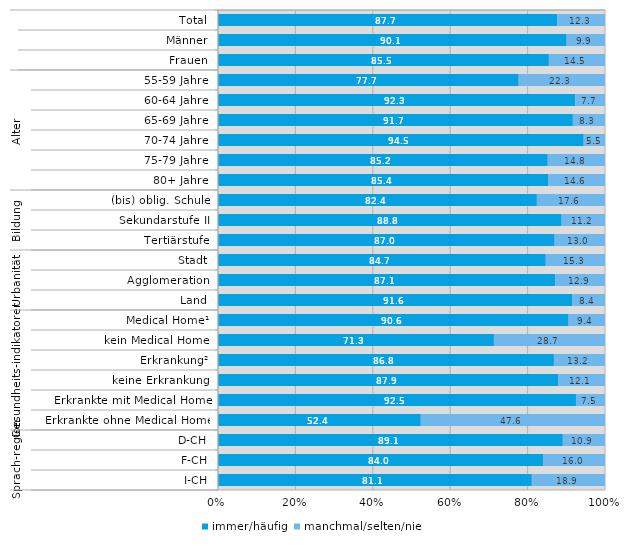
| Category | immer/häufig | manchmal/selten/nie |
|---|---|---|
| 0 | 87.7 | 12.3 |
| 1 | 90.1 | 9.9 |
| 2 | 85.5 | 14.5 |
| 3 | 77.7 | 22.3 |
| 4 | 92.3 | 7.7 |
| 5 | 91.7 | 8.3 |
| 6 | 94.5 | 5.5 |
| 7 | 85.2 | 14.8 |
| 8 | 85.4 | 14.6 |
| 9 | 82.4 | 17.6 |
| 10 | 88.8 | 11.2 |
| 11 | 87 | 13 |
| 12 | 84.7 | 15.3 |
| 13 | 87.1 | 12.9 |
| 14 | 91.6 | 8.4 |
| 15 | 90.6 | 9.4 |
| 16 | 71.3 | 28.7 |
| 17 | 86.8 | 13.2 |
| 18 | 87.9 | 12.1 |
| 19 | 92.5 | 7.5 |
| 20 | 52.4 | 47.6 |
| 21 | 89.1 | 10.9 |
| 22 | 84 | 16 |
| 23 | 81.1 | 18.9 |